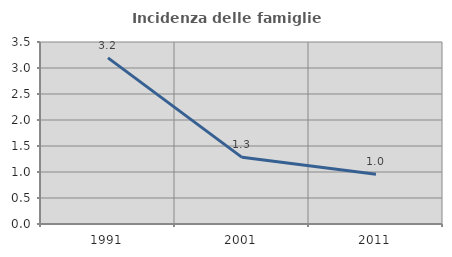
| Category | Incidenza delle famiglie numerose |
|---|---|
| 1991.0 | 3.194 |
| 2001.0 | 1.282 |
| 2011.0 | 0.958 |